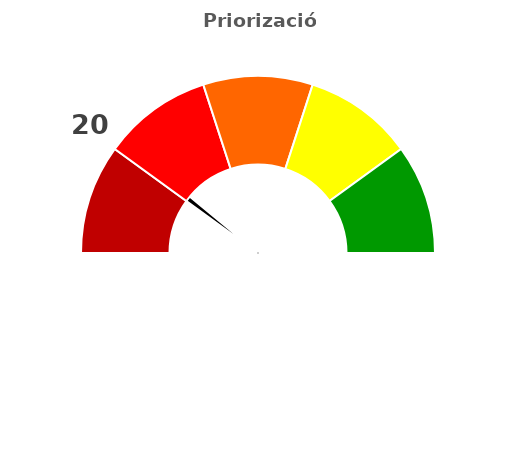
| Category | refe |
|---|---|
| 0 | 20 |
| 1 | 2 |
| 2 | 178 |